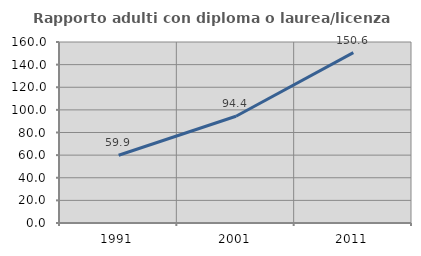
| Category | Rapporto adulti con diploma o laurea/licenza media  |
|---|---|
| 1991.0 | 59.915 |
| 2001.0 | 94.383 |
| 2011.0 | 150.587 |